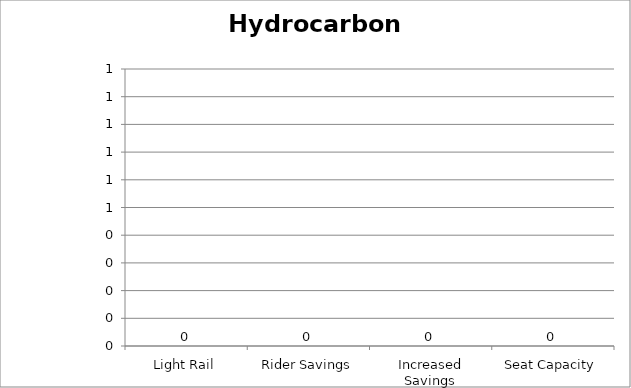
| Category | Hydrocarbons |
|---|---|
| Light Rail | 0 |
| Rider Savings | 0 |
| Increased Savings | 0 |
| Seat Capacity | 0 |